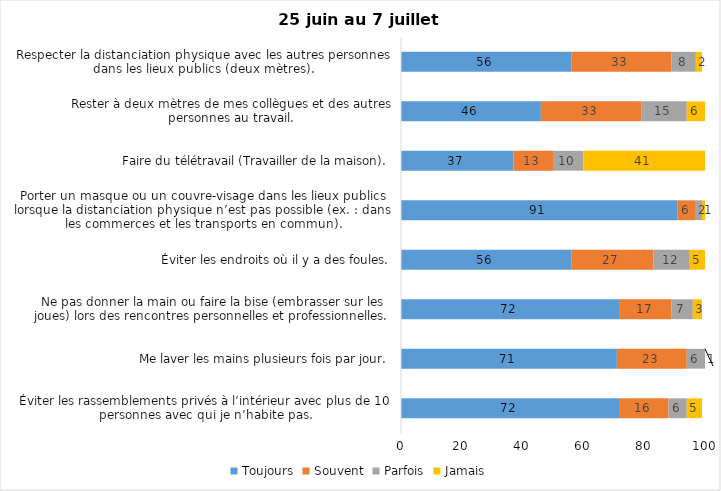
| Category | Toujours | Souvent | Parfois | Jamais |
|---|---|---|---|---|
| Éviter les rassemblements privés à l’intérieur avec plus de 10 personnes avec qui je n’habite pas. | 72 | 16 | 6 | 5 |
| Me laver les mains plusieurs fois par jour. | 71 | 23 | 6 | 1 |
| Ne pas donner la main ou faire la bise (embrasser sur les joues) lors des rencontres personnelles et professionnelles. | 72 | 17 | 7 | 3 |
| Éviter les endroits où il y a des foules. | 56 | 27 | 12 | 5 |
| Porter un masque ou un couvre-visage dans les lieux publics lorsque la distanciation physique n’est pas possible (ex. : dans les commerces et les transports en commun). | 91 | 6 | 2 | 1 |
| Faire du télétravail (Travailler de la maison). | 37 | 13 | 10 | 41 |
| Rester à deux mètres de mes collègues et des autres personnes au travail. | 46 | 33 | 15 | 6 |
| Respecter la distanciation physique avec les autres personnes dans les lieux publics (deux mètres). | 56 | 33 | 8 | 2 |